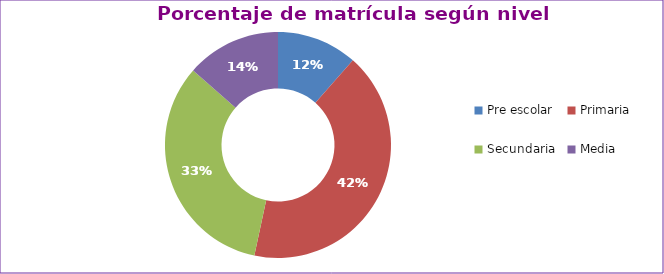
| Category | Series 0 |
|---|---|
| Pre escolar | 0.115 |
| Primaria | 0.418 |
| Secundaria | 0.331 |
| Media | 0.135 |